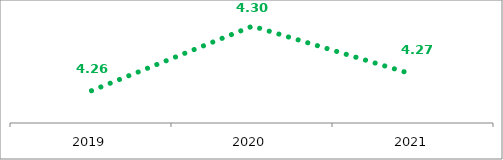
| Category | Employee Engagement |
|---|---|
| 2019.0 | 4.26 |
| 2020.0 | 4.3 |
| 2021.0 | 4.27 |